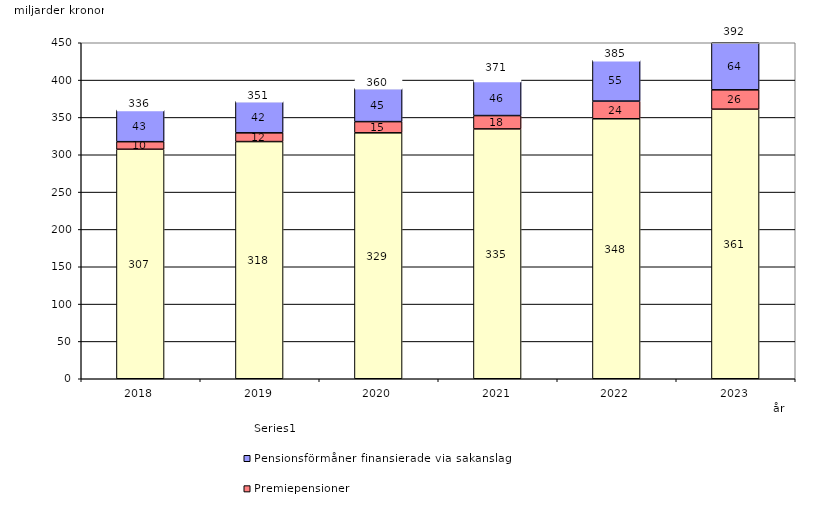
| Category | Inkomstpension och tilläggspension m.m. | Premiepensioner | Pensionsförmåner finansierade via sakanslag | Series 0 |
|---|---|---|---|---|
| 2018.0 | 307.356 | 10.141 | 42.55 | 20 |
| 2019.0 | 317.628 | 11.715 | 42.22 | 20 |
| 2020.0 | 329.365 | 15.016 | 44.546 | 20 |
| 2021.0 | 334.629 | 17.837 | 46.327 | 20 |
| 2022.0 | 348.202 | 23.669 | 54.695 | 20 |
| 2023.0 | 361.006 | 25.953 | 63.831 | 20 |